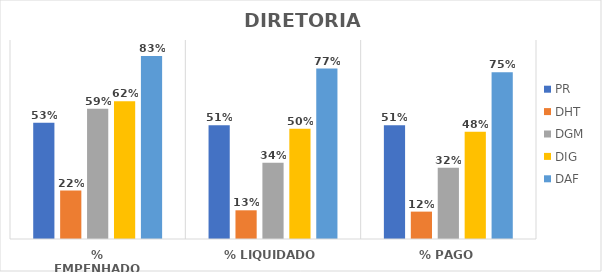
| Category | PR | DHT | DGM | DIG | DAF |
|---|---|---|---|---|---|
| % EMPENHADO | 0.526 | 0.219 | 0.589 | 0.623 | 0.828 |
| % LIQUIDADO | 0.515 | 0.13 | 0.345 | 0.498 | 0.771 |
| % PAGO | 0.514 | 0.124 | 0.322 | 0.485 | 0.754 |